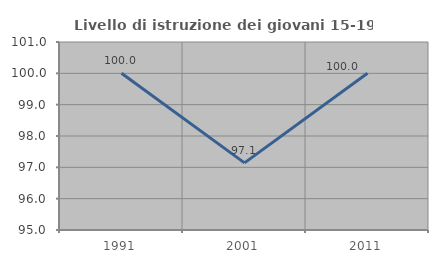
| Category | Livello di istruzione dei giovani 15-19 anni |
|---|---|
| 1991.0 | 100 |
| 2001.0 | 97.143 |
| 2011.0 | 100 |